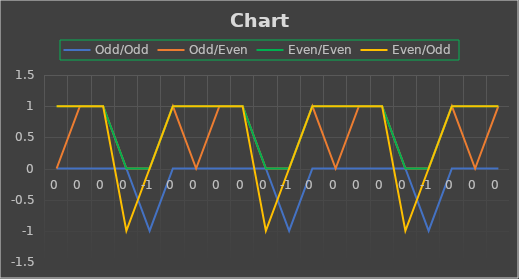
| Category | Odd/Odd | Odd/Even | Even/Even | Even/Odd |
|---|---|---|---|---|
| 0.0 | 0 | 0 | 1 | 0 |
| 0.0 | 0 | 1 | 0 | 0 |
| 0.0 | 0 | 1 | 0 | 0 |
| 0.0 | 0 | 0 | 0 | -1 |
| -1.0 | -1 | 0 | 0 | 0 |
| 0.0 | 0 | 1 | 0 | 0 |
| 0.0 | 0 | 0 | 1 | 0 |
| 0.0 | 0 | 1 | 0 | 0 |
| 0.0 | 0 | 1 | 0 | 0 |
| 0.0 | 0 | 0 | 0 | -1 |
| -1.0 | -1 | 0 | 0 | 0 |
| 0.0 | 0 | 1 | 0 | 0 |
| 0.0 | 0 | 0 | 1 | 0 |
| 0.0 | 0 | 1 | 0 | 0 |
| 0.0 | 0 | 1 | 0 | 0 |
| 0.0 | 0 | 0 | 0 | -1 |
| -1.0 | -1 | 0 | 0 | 0 |
| 0.0 | 0 | 1 | 0 | 0 |
| 0.0 | 0 | 0 | 1 | 0 |
| 0.0 | 0 | 1 | 0 | 0 |